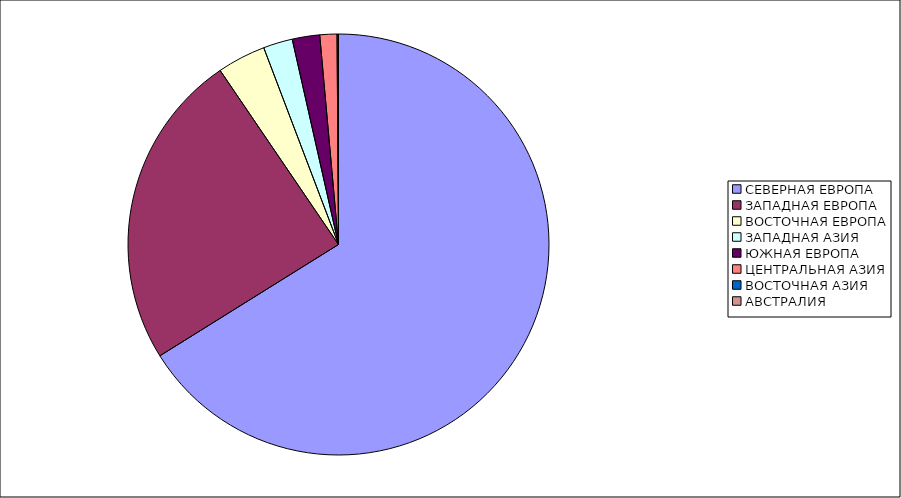
| Category | Оборот |
|---|---|
| СЕВЕРНАЯ ЕВРОПА | 66.128 |
| ЗАПАДНАЯ ЕВРОПА | 24.366 |
| ВОСТОЧНАЯ ЕВРОПА | 3.726 |
| ЗАПАДНАЯ АЗИЯ | 2.247 |
| ЮЖНАЯ ЕВРОПА | 2.107 |
| ЦЕНТРАЛЬНАЯ АЗИЯ | 1.315 |
| ВОСТОЧНАЯ АЗИЯ | 0.106 |
| АВСТРАЛИЯ | 0.003 |